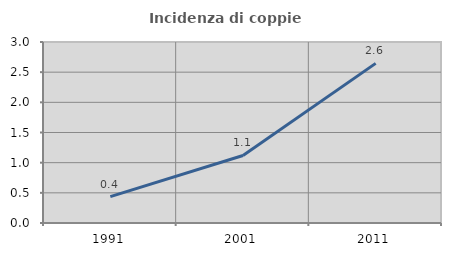
| Category | Incidenza di coppie miste |
|---|---|
| 1991.0 | 0.436 |
| 2001.0 | 1.119 |
| 2011.0 | 2.646 |